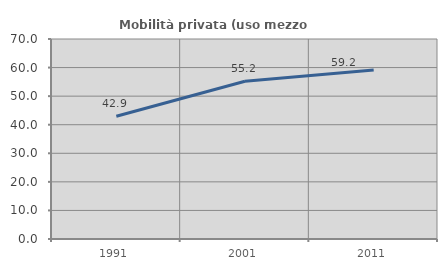
| Category | Mobilità privata (uso mezzo privato) |
|---|---|
| 1991.0 | 42.94 |
| 2001.0 | 55.214 |
| 2011.0 | 59.19 |